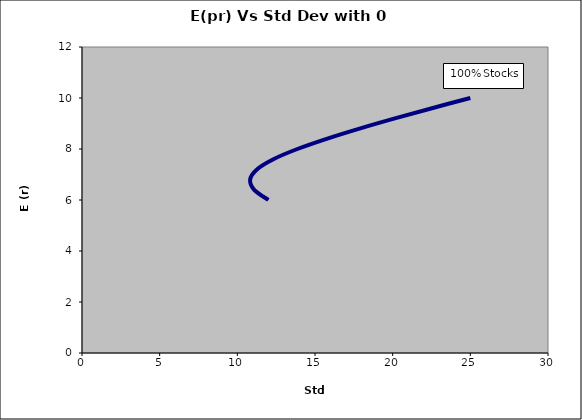
| Category | Series 0 |
|---|---|
| 12.0 | 6 |
| 11.085576214162257 | 6.4 |
| 10.824047302187848 | 6.8 |
| 11.260994627474075 | 7.2 |
| 12.322337440599489 | 7.6 |
| 13.865424623862047 | 8 |
| 15.749285698088025 | 8.4 |
| 17.86644900364927 | 8.8 |
| 20.143485299222675 | 9.2 |
| 22.531977276750478 | 9.6 |
| 24.999999999999996 | 10 |